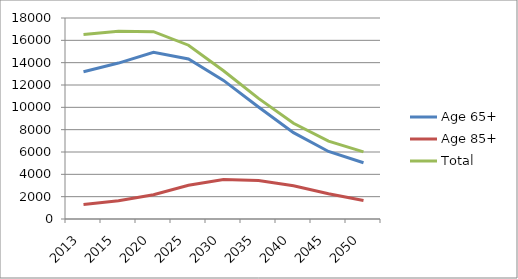
| Category | Age 65+ | Age 85+ | Total |
|---|---|---|---|
| 2013.0 | 13184.75 | 1295.99 | 16519.52 |
| 2015.0 | 13963.566 | 1631.508 | 16814.654 |
| 2020.0 | 14933.328 | 2172.298 | 16774.035 |
| 2025.0 | 14333.997 | 3014.672 | 15562.697 |
| 2030.0 | 12414.378 | 3545.822 | 13277.27 |
| 2035.0 | 10031.765 | 3441.254 | 10798.77 |
| 2040.0 | 7729.488 | 2980.001 | 8566.731 |
| 2045.0 | 6048.116 | 2261.55 | 6974.414 |
| 2050.0 | 5036.268 | 1655.842 | 6013.043 |